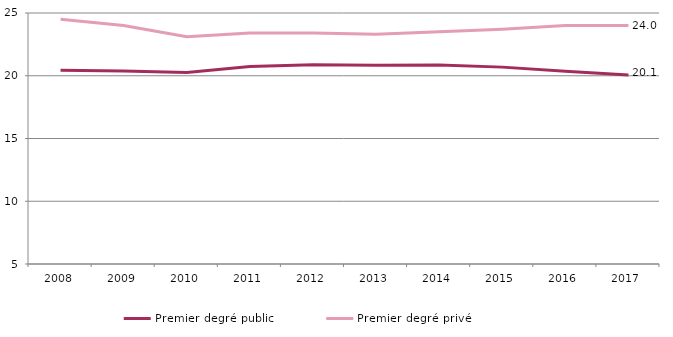
| Category | Premier degré public | Premier degré privé |
|---|---|---|
| 2008.0 | 20.443 | 24.5 |
| 2009.0 | 20.377 | 24 |
| 2010.0 | 20.263 | 23.1 |
| 2011.0 | 20.743 | 23.4 |
| 2012.0 | 20.882 | 23.4 |
| 2013.0 | 20.844 | 23.3 |
| 2014.0 | 20.847 | 23.5 |
| 2015.0 | 20.687 | 23.7 |
| 2016.0 | 20.363 | 24 |
| 2017.0 | 20.053 | 24 |